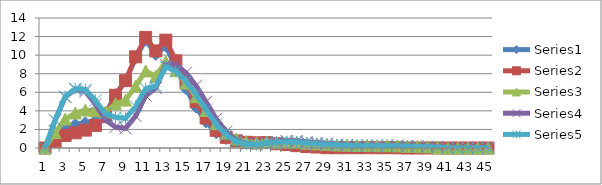
| Category | Series 0 | Series 1 | Series 2 | Series 3 | Series 4 |
|---|---|---|---|---|---|
| 0 | 0 | 0 | 0 | 0 | 0 |
| 1 | 1.184 | 0.727 | 1.652 | 2.978 | 2.991 |
| 2 | 2.171 | 1.352 | 3.117 | 5.497 | 5.535 |
| 3 | 2.526 | 1.635 | 3.771 | 6.313 | 6.398 |
| 4 | 2.713 | 1.927 | 4.084 | 6.103 | 6.303 |
| 5 | 2.95 | 2.43 | 4.006 | 4.719 | 5.128 |
| 6 | 3.618 | 3.373 | 3.88 | 3.029 | 3.696 |
| 7 | 5.745 | 5.675 | 4.757 | 2.261 | 3.3 |
| 8 | 7.218 | 7.252 | 5.157 | 2.118 | 3.193 |
| 9 | 9.699 | 9.817 | 6.677 | 3.432 | 4.49 |
| 10 | 11.643 | 11.91 | 8.3 | 5.64 | 6.403 |
| 11 | 10.072 | 10.456 | 7.733 | 6.442 | 6.672 |
| 12 | 10.978 | 11.615 | 9.314 | 8.986 | 8.733 |
| 13 | 8.675 | 9.389 | 8.325 | 8.969 | 8.293 |
| 14 | 6.393 | 7.079 | 6.995 | 8.114 | 7.214 |
| 15 | 4.407 | 4.987 | 5.531 | 6.716 | 5.773 |
| 16 | 2.809 | 3.233 | 4.036 | 4.978 | 4.147 |
| 17 | 1.647 | 1.901 | 2.624 | 3.147 | 2.548 |
| 18 | 1.018 | 1.144 | 1.628 | 1.765 | 1.402 |
| 19 | 0.714 | 0.758 | 0.974 | 0.855 | 0.693 |
| 20 | 0.604 | 0.613 | 0.659 | 0.453 | 0.409 |
| 21 | 0.556 | 0.556 | 0.555 | 0.382 | 0.383 |
| 22 | 0.574 | 0.579 | 0.633 | 0.549 | 0.543 |
| 23 | 0.452 | 0.46 | 0.619 | 0.657 | 0.618 |
| 24 | 0.357 | 0.364 | 0.636 | 0.759 | 0.682 |
| 25 | 0.252 | 0.253 | 0.598 | 0.756 | 0.656 |
| 26 | 0.164 | 0.156 | 0.508 | 0.653 | 0.551 |
| 27 | 0.117 | 0.105 | 0.442 | 0.557 | 0.463 |
| 28 | 0.097 | 0.035 | 0.394 | 0.474 | 0.392 |
| 29 | 0.09 | 0.031 | 0.336 | 0.379 | 0.317 |
| 30 | 0.094 | 0.031 | 0.301 | 0.318 | 0.274 |
| 31 | 0.097 | 0.032 | 0.27 | 0.276 | 0.244 |
| 32 | 0.105 | 0.035 | 0.271 | 0.276 | 0.25 |
| 33 | 0.096 | 0.032 | 0.246 | 0.258 | 0.235 |
| 34 | 0.096 | 0.032 | 0.252 | 0.275 | 0.25 |
| 35 | 0.07 | 0.023 | 0.224 | 0.254 | 0.23 |
| 36 | 0 | 0 | 0.18 | 0.211 | 0.189 |
| 37 | 0 | 0 | 0.156 | 0.188 | 0.168 |
| 38 | 0 | 0 | 0.121 | 0.144 | 0.128 |
| 39 | 0 | 0 | 0.037 | 0.105 | 0.093 |
| 40 | 0 | 0 | 0 | 0.018 | 0.016 |
| 41 | 0 | 0 | 0 | 0 | 0 |
| 42 | 0 | 0 | 0 | 0 | 0 |
| 43 | 0 | 0 | 0 | 0 | 0 |
| 44 | 0 | 0 | 0 | 0 | 0 |